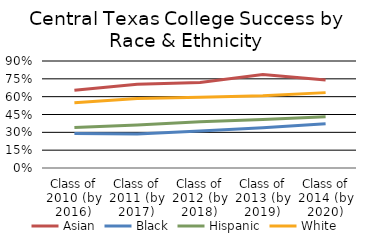
| Category | Asian | Black | Hispanic | White |
|---|---|---|---|---|
| Class of 2010 (by 2016) | 0.653 | 0.29 | 0.34 | 0.549 |
| Class of 2011 (by 2017) | 0.705 | 0.285 | 0.362 | 0.585 |
| Class of 2012 (by 2018) | 0.719 | 0.312 | 0.388 | 0.595 |
| Class of 2013 (by 2019) | 0.786 | 0.339 | 0.407 | 0.607 |
| Class of 2014 (by 2020) | 0.74 | 0.373 | 0.431 | 0.634 |